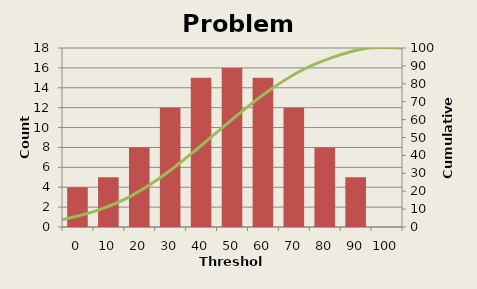
| Category | Count |
|---|---|
| 0.0 | 4 |
| 10.0 | 5 |
| 20.0 | 8 |
| 30.0 | 12 |
| 40.0 | 15 |
| 50.0 | 16 |
| 60.0 | 15 |
| 70.0 | 12 |
| 80.0 | 8 |
| 90.0 | 5 |
| 100.0 | 0 |